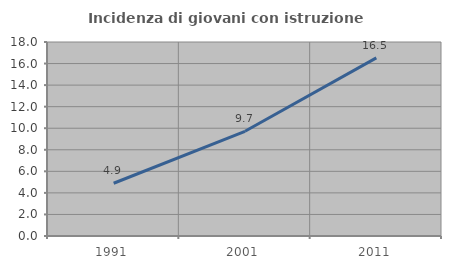
| Category | Incidenza di giovani con istruzione universitaria |
|---|---|
| 1991.0 | 4.893 |
| 2001.0 | 9.716 |
| 2011.0 | 16.524 |